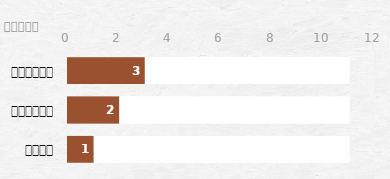
| Category | Series 2 | Series 3 | Series 1 | Series 0 |
|---|---|---|---|---|
| अन्य | 11 | 1 | 11 | 1 |
| दुल्हा | 11 | 2 | 11 | 2 |
| दुल्हन | 11 | 3 | 11 | 3 |